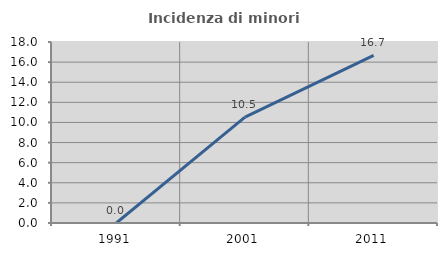
| Category | Incidenza di minori stranieri |
|---|---|
| 1991.0 | 0 |
| 2001.0 | 10.526 |
| 2011.0 | 16.667 |